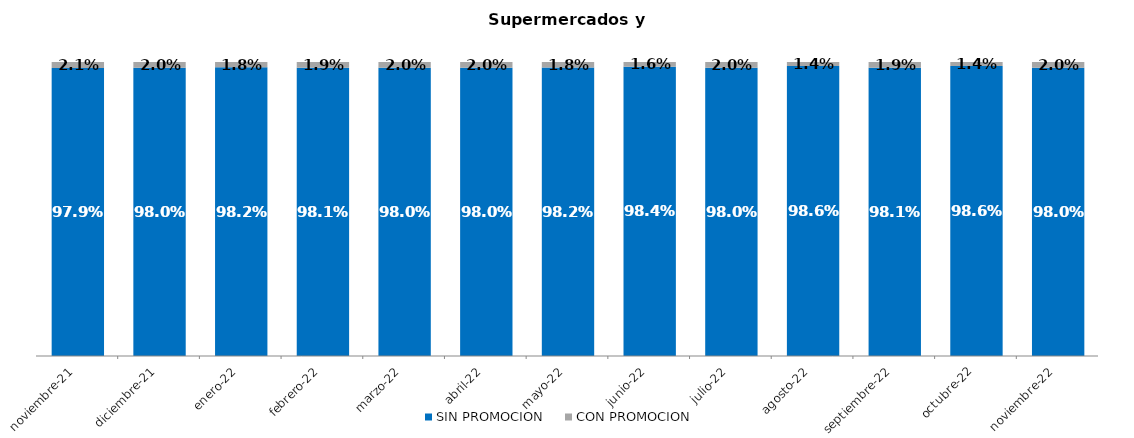
| Category | SIN PROMOCION   | CON PROMOCION   |
|---|---|---|
| 2021-11-01 | 0.979 | 0.021 |
| 2021-12-01 | 0.98 | 0.02 |
| 2022-01-01 | 0.982 | 0.018 |
| 2022-02-01 | 0.981 | 0.019 |
| 2022-03-01 | 0.98 | 0.02 |
| 2022-04-01 | 0.98 | 0.02 |
| 2022-05-01 | 0.982 | 0.018 |
| 2022-06-01 | 0.984 | 0.016 |
| 2022-07-01 | 0.98 | 0.02 |
| 2022-08-01 | 0.986 | 0.014 |
| 2022-09-01 | 0.981 | 0.019 |
| 2022-10-01 | 0.986 | 0.014 |
| 2022-11-01 | 0.98 | 0.02 |